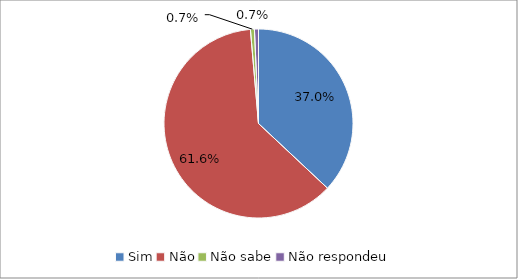
| Category | Series 0 |
|---|---|
| Sim | 0.37 |
| Não | 0.616 |
| Não sabe | 0.007 |
| Não respondeu | 0.007 |